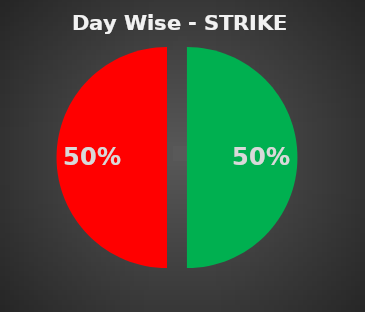
| Category | Series 0 |
|---|---|
| 0 | 0.5 |
| 1 | 0.5 |